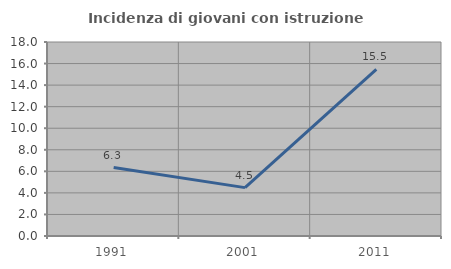
| Category | Incidenza di giovani con istruzione universitaria |
|---|---|
| 1991.0 | 6.349 |
| 2001.0 | 4.487 |
| 2011.0 | 15.464 |